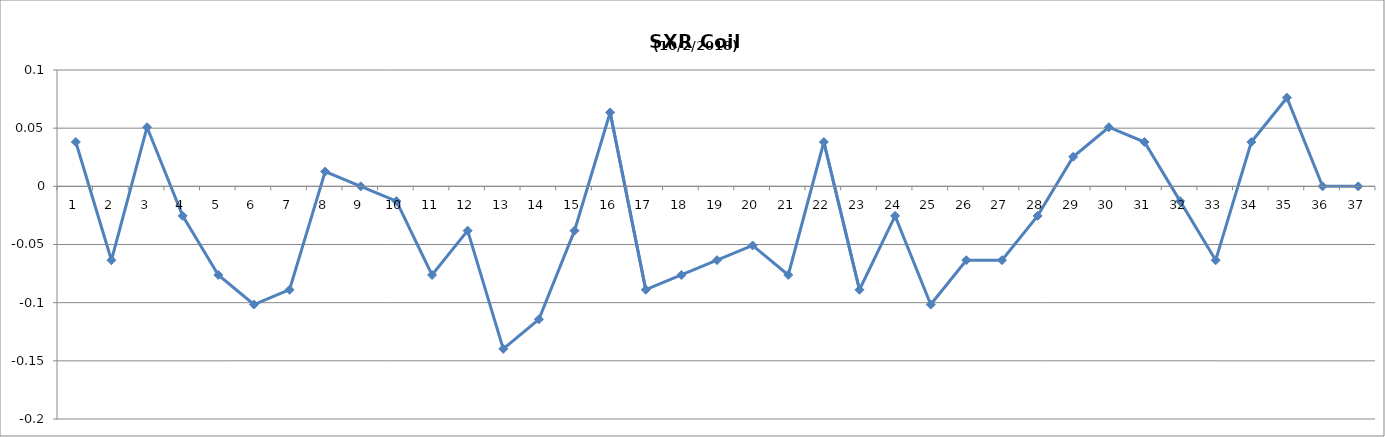
| Category | Series 0 |
|---|---|
| 0 | 0.038 |
| 1 | -0.064 |
| 2 | 0.051 |
| 3 | -0.025 |
| 4 | -0.076 |
| 5 | -0.102 |
| 6 | -0.089 |
| 7 | 0.013 |
| 8 | 0 |
| 9 | -0.013 |
| 10 | -0.076 |
| 11 | -0.038 |
| 12 | -0.14 |
| 13 | -0.114 |
| 14 | -0.038 |
| 15 | 0.063 |
| 16 | -0.089 |
| 17 | -0.076 |
| 18 | -0.064 |
| 19 | -0.051 |
| 20 | -0.076 |
| 21 | 0.038 |
| 22 | -0.089 |
| 23 | -0.025 |
| 24 | -0.102 |
| 25 | -0.064 |
| 26 | -0.063 |
| 27 | -0.025 |
| 28 | 0.025 |
| 29 | 0.051 |
| 30 | 0.038 |
| 31 | -0.013 |
| 32 | -0.064 |
| 33 | 0.038 |
| 34 | 0.076 |
| 35 | 0 |
| 36 | 0 |